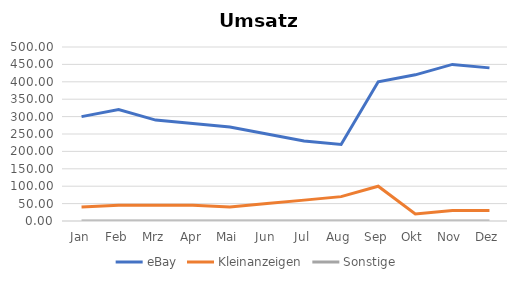
| Category | eBay | Kleinanzeigen | Sonstige |
|---|---|---|---|
| Jan | 300 | 40 | 0 |
| Feb | 320 | 45 | 0 |
| Mrz | 290 | 45 | 0 |
| Apr | 280 | 45 | 0 |
| Mai | 270 | 40 | 0 |
| Jun | 250 | 50 | 0 |
| Jul | 230 | 60 | 0 |
| Aug | 220 | 70 | 0 |
| Sep | 400 | 100 | 0 |
| Okt | 420 | 20 | 0 |
| Nov | 450 | 30 | 0 |
| Dez | 440 | 30 | 0 |